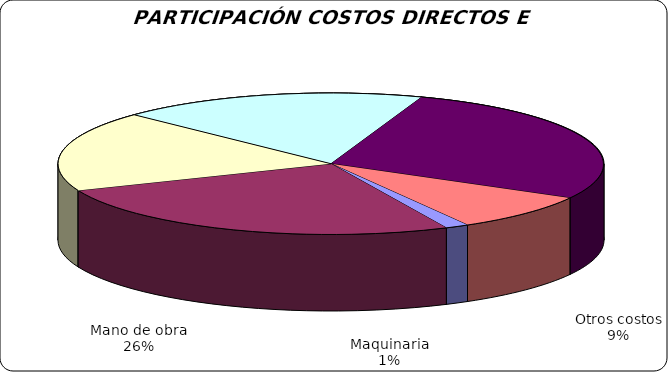
| Category | Series 0 |
|---|---|
| Maquinaria | 154800 |
| Mano de obra | 2870000 |
| Semilla | 2040000 |
| Fertilizantes | 2027700 |
| Control sanitario | 3076205 |
| Otros costos | 960000 |